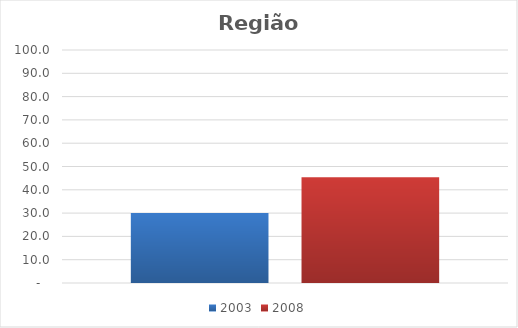
| Category | 2003 | 2008 |
|---|---|---|
| Total | 30 | 45.4 |